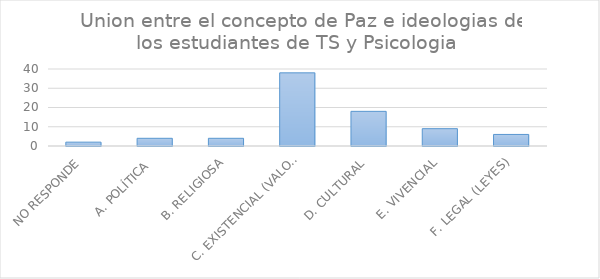
| Category | Series 0 |
|---|---|
| NO RESPONDE | 2 |
| A. POLÍTICA  | 4 |
| B. RELIGIOSA | 4 |
| C. EXISTENCIAL (VALORES) | 38 |
| D. CULTURAL | 18 |
| E. VIVENCIAL | 9 |
| F. LEGAL (LEYES) | 6 |